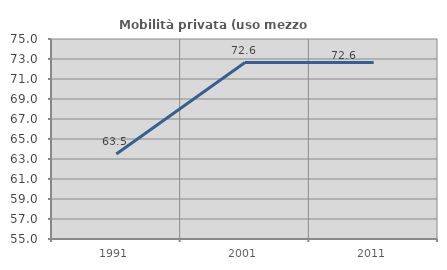
| Category | Mobilità privata (uso mezzo privato) |
|---|---|
| 1991.0 | 63.491 |
| 2001.0 | 72.648 |
| 2011.0 | 72.638 |